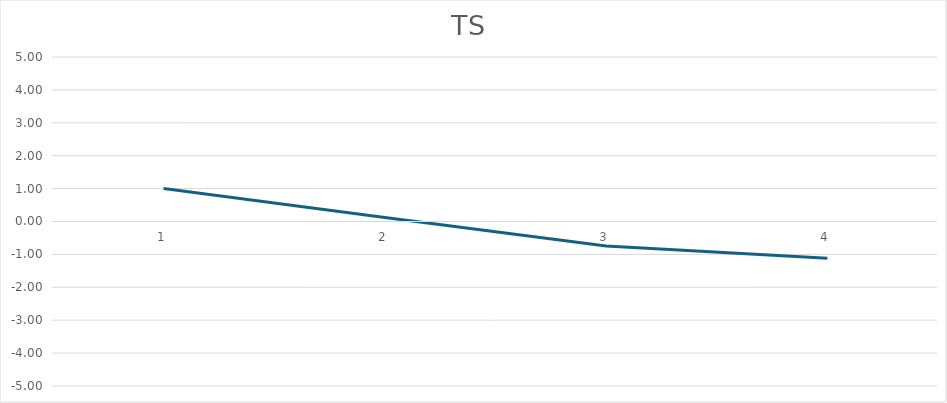
| Category | TS |
|---|---|
| 0 | 1 |
| 1 | 0.124 |
| 2 | -0.742 |
| 3 | -1.117 |